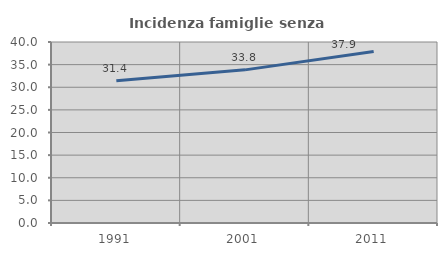
| Category | Incidenza famiglie senza nuclei |
|---|---|
| 1991.0 | 31.425 |
| 2001.0 | 33.843 |
| 2011.0 | 37.903 |